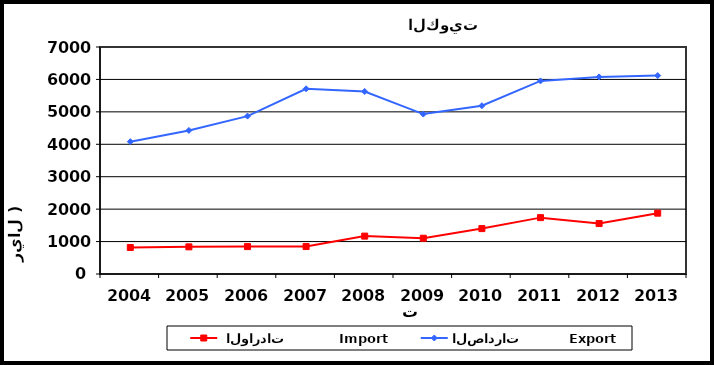
| Category |  الواردات           Import | الصادرات          Export |
|---|---|---|
| 2004.0 | 818 | 4081 |
| 2005.0 | 837 | 4428 |
| 2006.0 | 845 | 4869 |
| 2007.0 | 847 | 5711 |
| 2008.0 | 1168 | 5629 |
| 2009.0 | 1103 | 4932 |
| 2010.0 | 1400 | 5189 |
| 2011.0 | 1738 | 5954 |
| 2012.0 | 1556 | 6078 |
| 2013.0 | 1876 | 6119 |